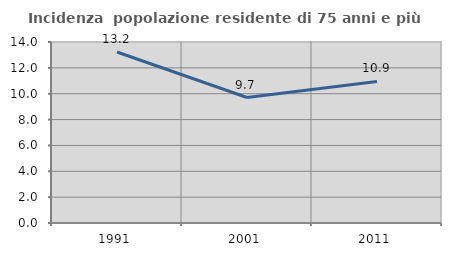
| Category | Incidenza  popolazione residente di 75 anni e più |
|---|---|
| 1991.0 | 13.228 |
| 2001.0 | 9.705 |
| 2011.0 | 10.95 |